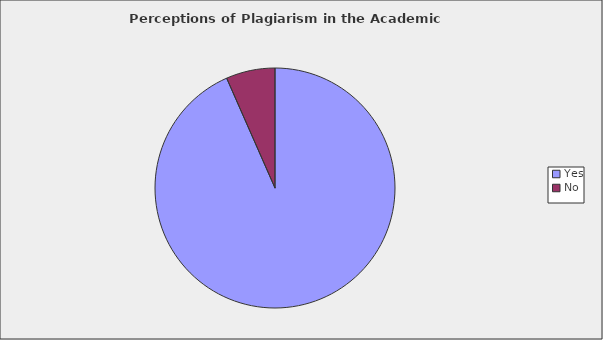
| Category | Series 0 |
|---|---|
| Yes | 0.934 |
| No | 0.066 |